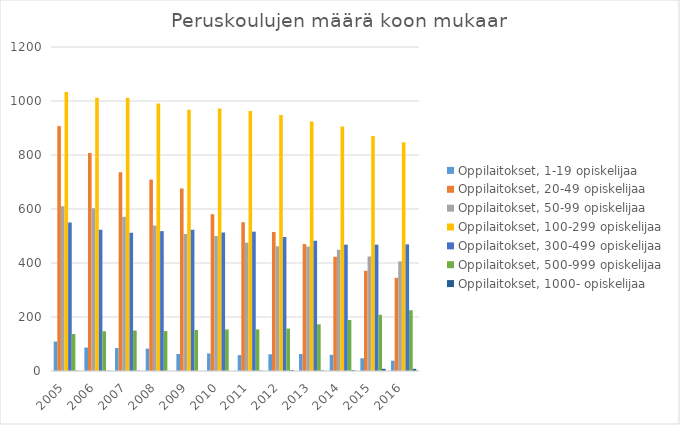
| Category | Oppilaitokset, 1-19 opiskelijaa | Oppilaitokset, 20-49 opiskelijaa | Oppilaitokset, 50-99 opiskelijaa | Oppilaitokset, 100-299 opiskelijaa | Oppilaitokset, 300-499 opiskelijaa | Oppilaitokset, 500-999 opiskelijaa | Oppilaitokset, 1000- opiskelijaa |
|---|---|---|---|---|---|---|---|
| 2005 | 109 | 907 | 610 | 1033 | 550 | 137 | 1 |
| 2006 | 87 | 807 | 603 | 1012 | 523 | 147 | 1 |
| 2007 | 85 | 736 | 571 | 1012 | 512 | 150 | 1 |
| 2008 | 83 | 709 | 539 | 991 | 518 | 148 | 0 |
| 2009 | 63 | 676 | 507 | 968 | 523 | 152 | 0 |
| 2010 | 65 | 581 | 500 | 972 | 513 | 154 | 0 |
| 2011 | 59 | 551 | 475 | 963 | 516 | 154 | 1 |
| 2012 | 62 | 515 | 462 | 948 | 496 | 157 | 3 |
| 2013 | 63 | 470 | 461 | 924 | 482 | 173 | 2 |
| 2014 | 60 | 423 | 449 | 906 | 468 | 189 | 3 |
| 2015 | 47 | 371 | 424 | 870 | 468 | 208 | 8 |
| 2016 | 38 | 345 | 406 | 847 | 469 | 225 | 8 |